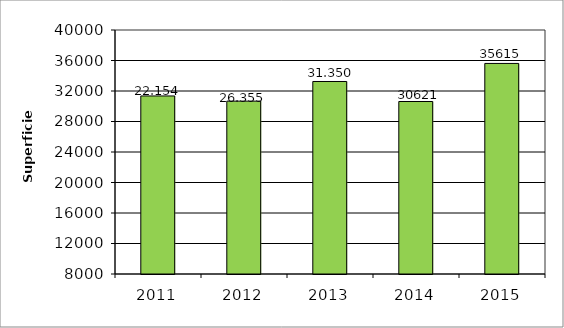
| Category | Series 0 |
|---|---|
| 2011.0 | 31350 |
| 2012.0 | 30672 |
| 2013.0 | 33247 |
| 2014.0 | 30621 |
| 2015.0 | 35615 |